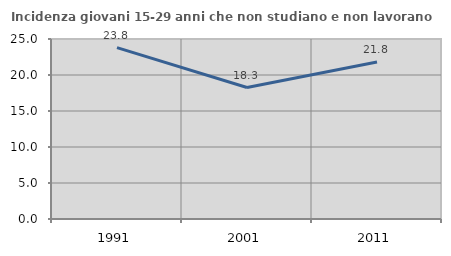
| Category | Incidenza giovani 15-29 anni che non studiano e non lavorano  |
|---|---|
| 1991.0 | 23.81 |
| 2001.0 | 18.261 |
| 2011.0 | 21.801 |